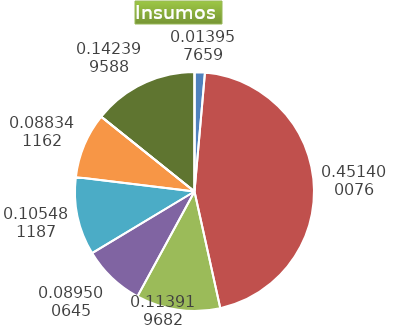
| Category | Series 0 |
|---|---|
| Control arvenses | 102386 |
| Control fitosanitario | 3311232 |
| Cosecha y beneficio | 835654.485 |
| Fertilización | 619852 |
| Instalación | 773754.153 |
| Otros | 648024 |
| Podas | 0 |
| Riego | 0 |
| Transporte | 1044568 |
| Tutorado | 0 |